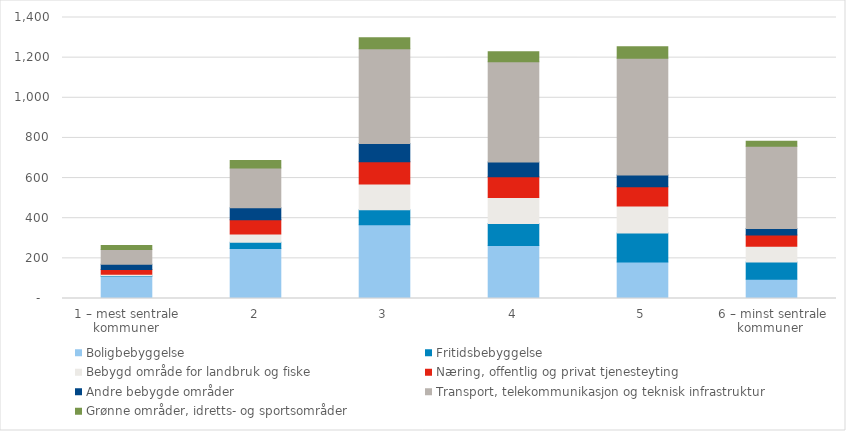
| Category | Boligbebyggelse | Fritidsbebyggelse | Bebygd område for landbruk og fiske | Næring, offentlig og privat tjenesteyting | Andre bebygde områder | Transport, telekommunikasjon og teknisk infrastruktur | Grønne områder, idretts- og sportsområder |
|---|---|---|---|---|---|---|---|
| 1 – mest sentrale kommuner | 110.38 | 3.28 | 7.06 | 23.5 | 26.68 | 73.08 | 19.51 |
| 2 | 248.5 | 32.01 | 40.57 | 71.01 | 60.09 | 198.19 | 37.59 |
| 3 | 366.93 | 74.87 | 128.56 | 111.31 | 91.14 | 471.67 | 54.66 |
| 4 | 263.81 | 109.72 | 130.05 | 102.69 | 74.18 | 499.28 | 50.2 |
| 5 | 181.31 | 144.59 | 134.4 | 96.42 | 59.04 | 581.3 | 56.89 |
| 6 – minst sentrale kommuner  | 95.58 | 86.17 | 78.48 | 56.05 | 33.09 | 409.34 | 24.93 |